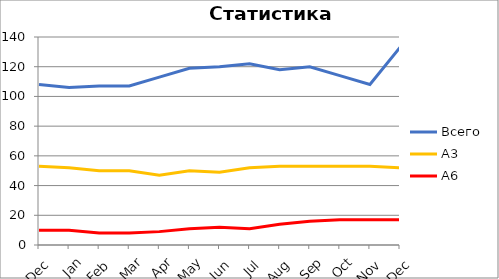
| Category | Всего | А3 | A6 |
|---|---|---|---|
| 0 | 108 | 53 | 10 |
| 1 | 106 | 52 | 10 |
| 2 | 107 | 50 | 8 |
| 3 | 107 | 50 | 8 |
| 4 | 113 | 47 | 9 |
| 5 | 119 | 50 | 11 |
| 6 | 120 | 49 | 12 |
| 7 | 122 | 52 | 11 |
| 8 | 118 | 53 | 14 |
| 9 | 120 | 53 | 16 |
| 10 | 114 | 53 | 17 |
| 11 | 108 | 53 | 17 |
| 12 | 133 | 52 | 17 |